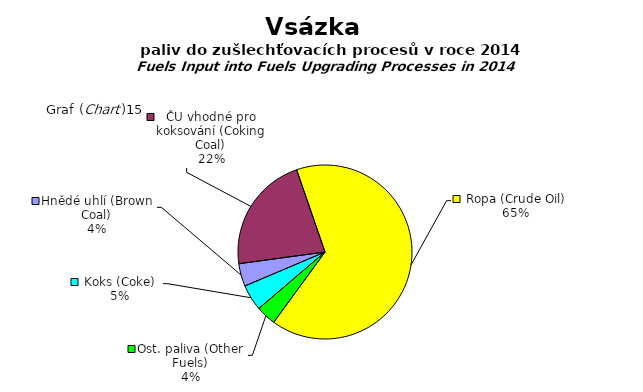
| Category | Series 0 |
|---|---|
| Hnědé uhlí (Brown Coal) | 20284811 |
| ČU vhodné pro koksování (Coking Coal) | 104896377 |
| Ropa (Crude Oil) | 313223332 |
| Ost. paliva (Other Fuels) | 17890423 |
| Koks (Coke) | 23281002 |